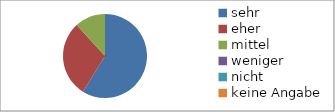
| Category | Series 0 |
|---|---|
| sehr | 10 |
| eher | 5 |
| mittel | 2 |
| weniger | 0 |
| nicht | 0 |
| keine Angabe | 0 |